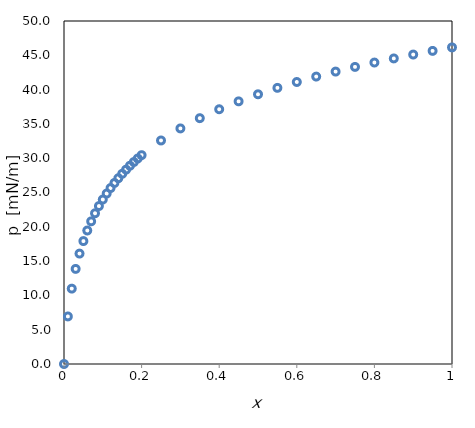
| Category | Presión superficial - composición |
|---|---|
| 0.0 | 0 |
| 0.01 | 6.931 |
| 0.02 | 10.986 |
| 0.03 | 13.863 |
| 0.04 | 16.094 |
| 0.05 | 17.918 |
| 0.060000000000000005 | 19.459 |
| 0.07 | 20.794 |
| 0.08 | 21.972 |
| 0.09 | 23.026 |
| 0.09999999999999999 | 23.979 |
| 0.10999999999999999 | 24.849 |
| 0.11999999999999998 | 25.649 |
| 0.12999999999999998 | 26.391 |
| 0.13999999999999999 | 27.081 |
| 0.15 | 27.726 |
| 0.16 | 28.332 |
| 0.17 | 28.904 |
| 0.18000000000000002 | 29.444 |
| 0.19000000000000003 | 29.957 |
| 0.20000000000000004 | 30.445 |
| 0.25000000000000006 | 32.581 |
| 0.30000000000000004 | 34.34 |
| 0.35000000000000003 | 35.835 |
| 0.4 | 37.136 |
| 0.45 | 38.286 |
| 0.5 | 39.318 |
| 0.55 | 40.254 |
| 0.6000000000000001 | 41.109 |
| 0.6500000000000001 | 41.897 |
| 0.7000000000000002 | 42.627 |
| 0.7500000000000002 | 43.307 |
| 0.8000000000000003 | 43.944 |
| 0.8500000000000003 | 44.543 |
| 0.9000000000000004 | 45.109 |
| 0.9500000000000004 | 45.643 |
| 1.0000000000000004 | 46.151 |